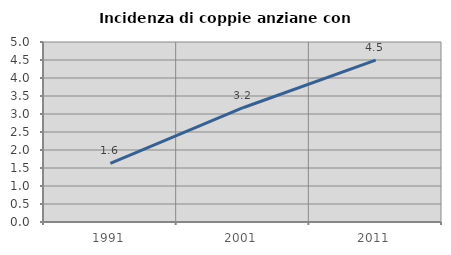
| Category | Incidenza di coppie anziane con figli |
|---|---|
| 1991.0 | 1.632 |
| 2001.0 | 3.175 |
| 2011.0 | 4.497 |